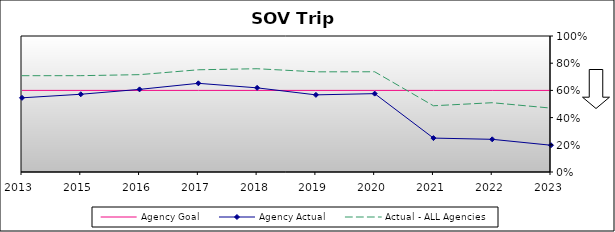
| Category | Agency Goal | Agency Actual | Actual - ALL Agencies |
|---|---|---|---|
| 2013.0 | 0.6 | 0.545 | 0.708 |
| 2015.0 | 0.6 | 0.572 | 0.708 |
| 2016.0 | 0.6 | 0.608 | 0.716 |
| 2017.0 | 0.6 | 0.652 | 0.752 |
| 2018.0 | 0.6 | 0.619 | 0.759 |
| 2019.0 | 0.6 | 0.567 | 0.736 |
| 2020.0 | 0.6 | 0.576 | 0.737 |
| 2021.0 | 0.6 | 0.249 | 0.487 |
| 2022.0 | 0.6 | 0.24 | 0.509 |
| 2023.0 | 0.6 | 0.197 | 0.47 |